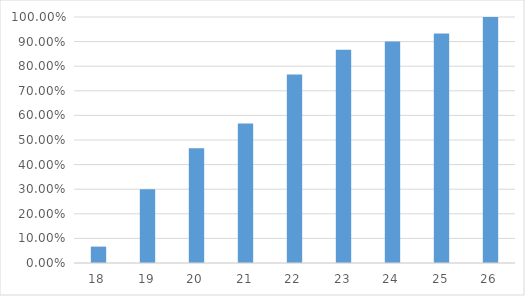
| Category | Series 0 |
|---|---|
| 18.0 | 0.067 |
| 19.0 | 0.3 |
| 20.0 | 0.467 |
| 21.0 | 0.567 |
| 22.0 | 0.767 |
| 23.0 | 0.867 |
| 24.0 | 0.9 |
| 25.0 | 0.933 |
| 26.0 | 1 |